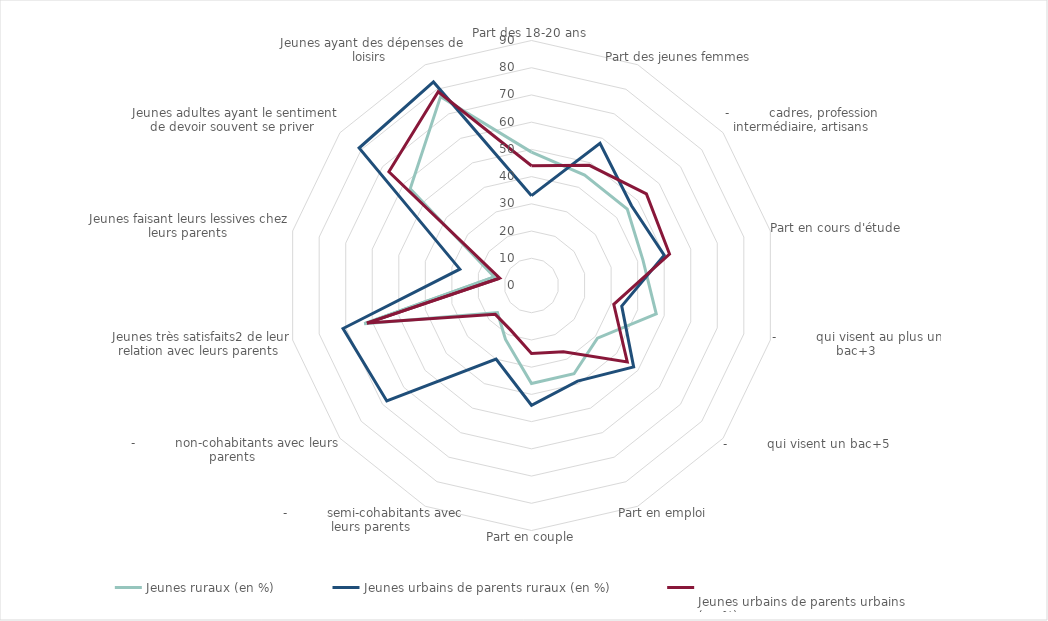
| Category | Jeunes ruraux (en %) | Jeunes urbains de parents ruraux (en %) | 
Jeunes urbains de parents urbains 
(en %) |
|---|---|---|---|
| Part des 18-20 ans | 49 | 33 | 44 |
| Part des jeunes femmes | 45 | 58 | 49 |
| -          cadres, profession intermédiaire, artisans | 45 | 47 | 54 |
| Part en cours d'étude | 42 | 50 | 52 |
| -          qui visent au plus un bac+3 | 47 | 34 | 31 |
| -          qui visent un bac+5 | 31 | 48 | 45 |
| Part en emploi | 36 | 39 | 27 |
| Part en couple | 36 | 44 | 25 |
| -          semi-cohabitants avec leurs parents  | 22 | 30 | 18 |
| -          non-cohabitants avec leurs parents  | 16 | 68 | 17 |
| Jeunes très satisfaits2 de leur relation avec leurs parents  | 63 | 71 | 62 |
| Jeunes faisant leurs lessives chez leurs parents  | 14 | 27 | 12 |
| Jeunes adultes ayant le sentiment de devoir souvent se priver  | 57 | 81 | 67 |
| Jeunes ayant des dépenses de loisirs  | 77 | 83 | 79 |